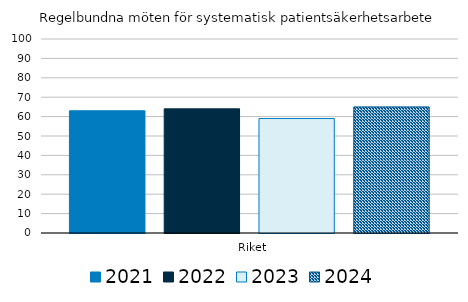
| Category | 2021 | 2022 | 2023 | 2024 |
|---|---|---|---|---|
|   Riket | 63 | 64 | 59 | 65 |